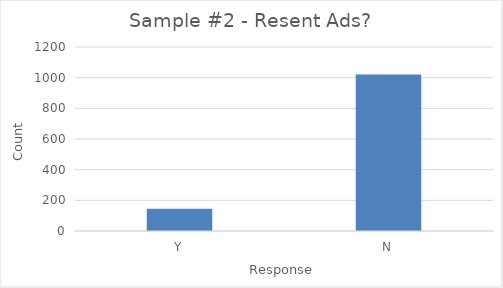
| Category | Series 0 |
|---|---|
| Y | 145 |
| N | 1021 |